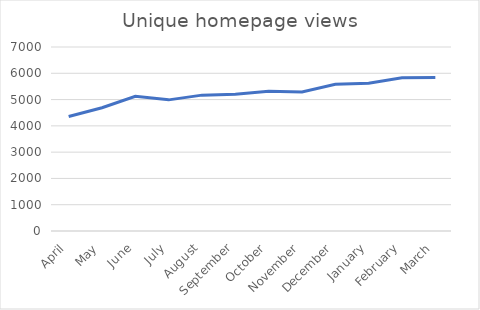
| Category | KPI3 eg unique homepage views |
|---|---|
| April | 4356 |
| May | 4689 |
| June | 5122 |
| July | 4989 |
| August | 5169 |
| September | 5205 |
| October | 5317 |
| November | 5287 |
| December | 5579 |
| January | 5621 |
| February | 5832 |
| March | 5839 |